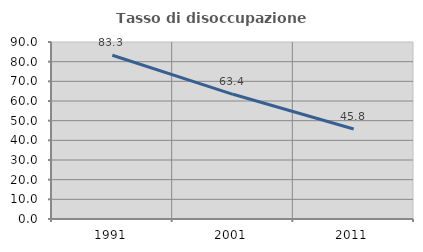
| Category | Tasso di disoccupazione giovanile  |
|---|---|
| 1991.0 | 83.283 |
| 2001.0 | 63.399 |
| 2011.0 | 45.783 |